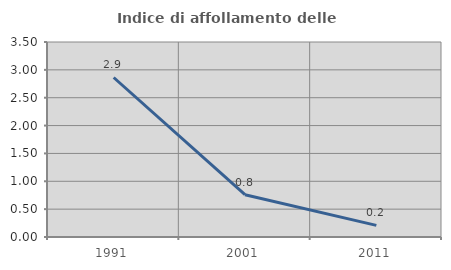
| Category | Indice di affollamento delle abitazioni  |
|---|---|
| 1991.0 | 2.863 |
| 2001.0 | 0.759 |
| 2011.0 | 0.209 |